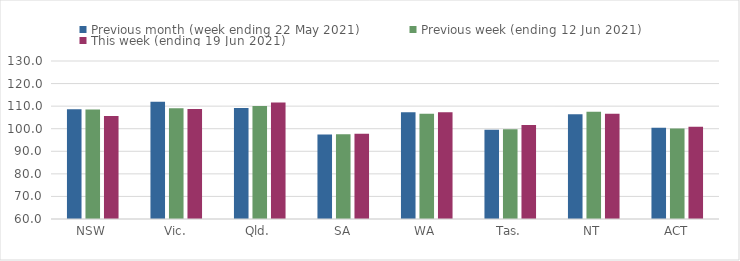
| Category | Previous month (week ending 22 May 2021) | Previous week (ending 12 Jun 2021) | This week (ending 19 Jun 2021) |
|---|---|---|---|
| NSW | 108.65 | 108.52 | 105.58 |
| Vic. | 111.9 | 109.04 | 108.74 |
| Qld. | 109.14 | 110.07 | 111.57 |
| SA | 97.47 | 97.5 | 97.8 |
| WA | 107.33 | 106.67 | 107.28 |
| Tas. | 99.58 | 99.74 | 101.66 |
| NT | 106.45 | 107.53 | 106.6 |
| ACT | 100.41 | 100.05 | 100.88 |